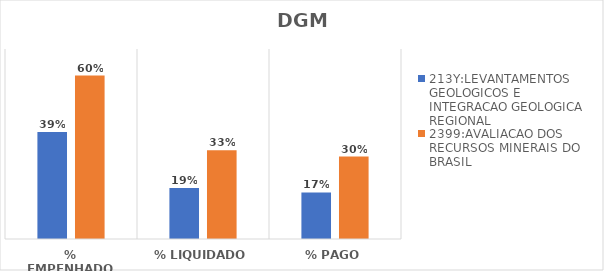
| Category | 213Y:LEVANTAMENTOS GEOLOGICOS E INTEGRACAO GEOLOGICA REGIONAL | 2399:AVALIACAO DOS RECURSOS MINERAIS DO BRASIL |
|---|---|---|
| % EMPENHADO | 0.394 | 0.602 |
| % LIQUIDADO | 0.188 | 0.327 |
| % PAGO | 0.172 | 0.304 |